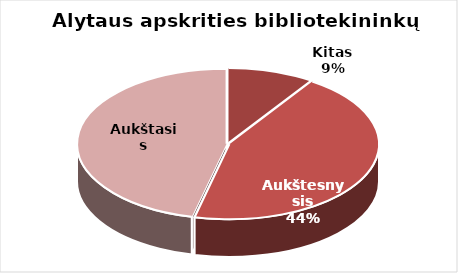
| Category | Series 0 |
|---|---|
| Kitas | 20 |
| Aukštesnysis | 95 |
| Aukštasis | 99 |